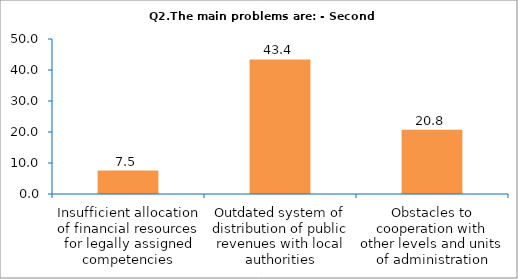
| Category | Series 0 |
|---|---|
| Insufficient allocation of financial resources for legally assigned competencies | 7.547 |
| Outdated system of distribution of public revenues with local authorities | 43.396 |
| Obstacles to cooperation with other levels and units of administration | 20.755 |